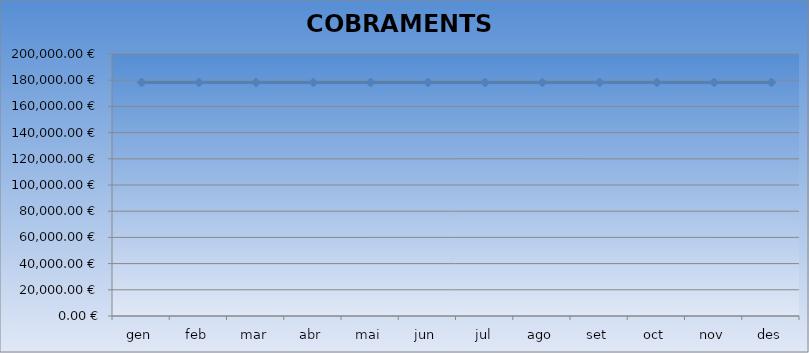
| Category | PREVISIÓ ANUAL COBRAMENTS  2024 | Series 1 |
|---|---|---|
| gen | 178247.71 |  |
| feb | 178247.71 |  |
| mar | 178247.71 |  |
| abr | 178247.71 |  |
| mai | 178247.71 |  |
| jun | 178247.71 |  |
| jul | 178247.71 |  |
| ago | 178247.71 |  |
| set | 178247.71 |  |
| oct | 178247.71 |  |
| nov | 178247.71 |  |
| des | 178247.71 |  |